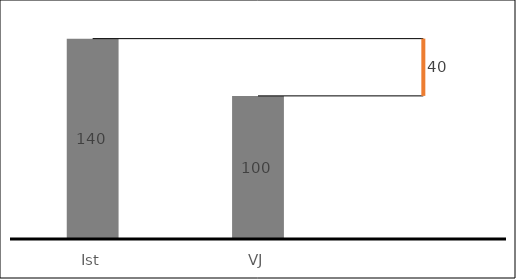
| Category | Säule |
|---|---|
| Ist | 140 |
| VJ | 100 |